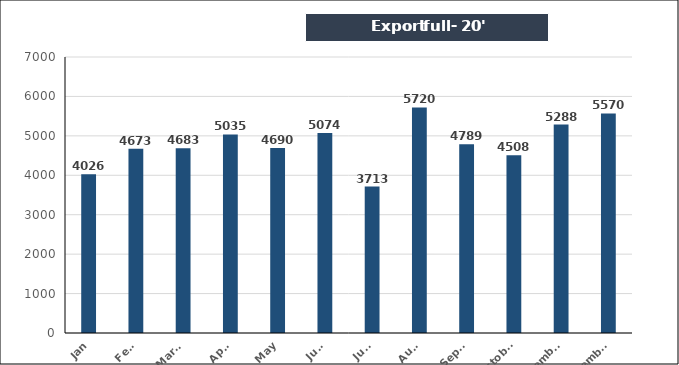
| Category | Export full - 20' |
|---|---|
| Jan | 4026 |
| Feb. | 4673 |
| March | 4683 |
| April | 5035 |
| May | 4690 |
| June | 5074 |
| July | 3713 |
| Aug. | 5720 |
| Sept. | 4789 |
| October | 4508 |
| November | 5288 |
| December | 5570 |